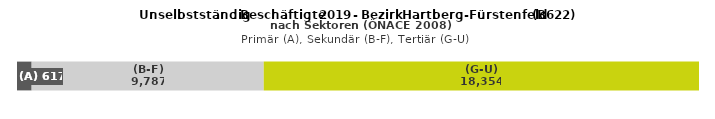
| Category | (A) | (B-F) | (G-U) |
|---|---|---|---|
| 0 | 617 | 9787 | 18354 |